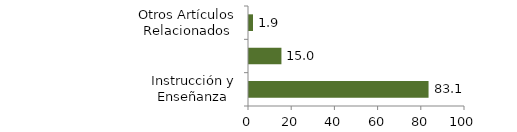
| Category | Educación |
|---|---|
| Instrucción y Enseñanza | 83.124 |
| Artículos Escolarers y Otros Relacionados | 15.015 |
| Otros Artículos Relacionados | 1.862 |